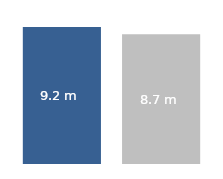
| Category | Actual | Plan |
|---|---|---|
| 0 | 9189052 | 8700835.806 |